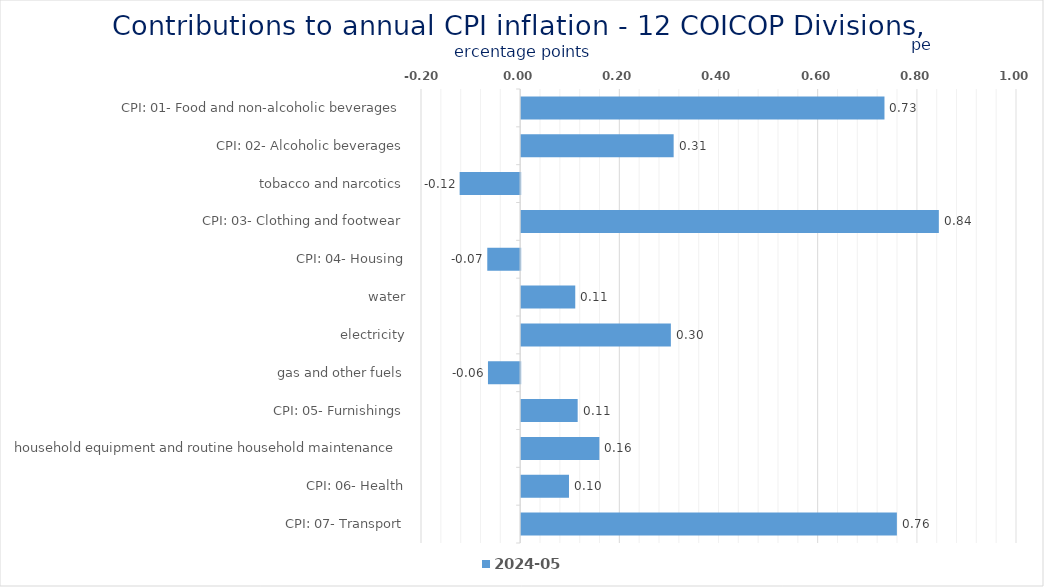
| Category | 2024-05 |
|---|---|
| CPI: 01- Food and non-alcoholic beverages | 0.733 |
| CPI: 02- Alcoholic beverages, tobacco and narcotics | 0.308 |
| CPI: 03- Clothing and footwear | -0.122 |
| CPI: 04- Housing, water, electricity, gas and other fuels | 0.842 |
| CPI: 05- Furnishings, household equipment and routine household maintenance | -0.066 |
| CPI: 06- Health | 0.109 |
| CPI: 07- Transport | 0.302 |
| CPI: 08- Communication | -0.065 |
| CPI: 09- Recreation and culture | 0.114 |
| CPI: 10- Education | 0.158 |
| CPI: 11- Restaurants and hotels | 0.096 |
| CPI: 12- Miscellaneous goods and services | 0.758 |